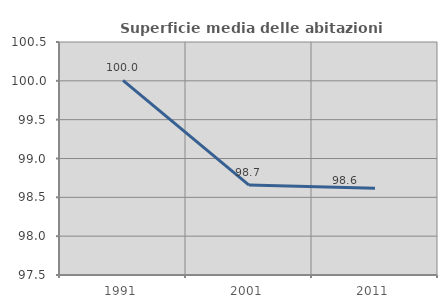
| Category | Superficie media delle abitazioni occupate |
|---|---|
| 1991.0 | 100.007 |
| 2001.0 | 98.658 |
| 2011.0 | 98.616 |